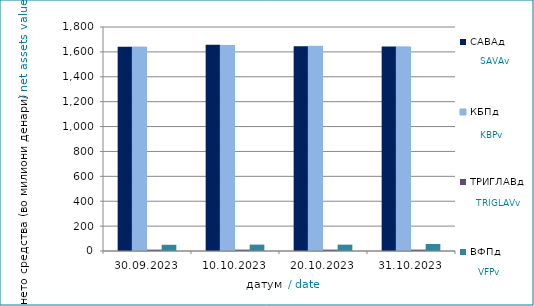
| Category | САВАд | КБПд | ТРИГЛАВд | ВФПд |
|---|---|---|---|---|
| 2023-09-30 | 1641.172 | 1638.494 | 11.049 | 49.85 |
| 2023-10-10 | 1656.54 | 1651.621 | 11.197 | 51.337 |
| 2023-10-20 | 1645.999 | 1645.034 | 11.164 | 51.047 |
| 2023-10-31 | 1643.171 | 1640.143 | 11.169 | 56.45 |